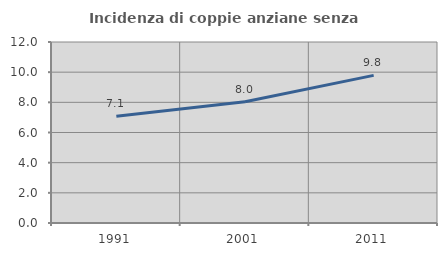
| Category | Incidenza di coppie anziane senza figli  |
|---|---|
| 1991.0 | 7.085 |
| 2001.0 | 8.037 |
| 2011.0 | 9.788 |